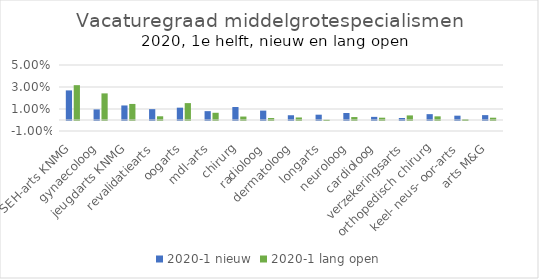
| Category | 2020-1 |
|---|---|
| SEH-arts KNMG | 0.032 |
| gynaecoloog | 0.024 |
| jeugdarts KNMG | 0.015 |
| revalidatiearts | 0.003 |
| oogarts | 0.015 |
| mdl-arts | 0.007 |
| chirurg | 0.003 |
| radioloog | 0.002 |
| dermatoloog | 0.002 |
| longarts | 0 |
| neuroloog | 0.003 |
| cardioloog | 0.002 |
| verzekeringsarts | 0.004 |
| orthopedisch chirurg | 0.003 |
| keel- neus- oor-arts | 0.001 |
| arts M&G | 0.002 |